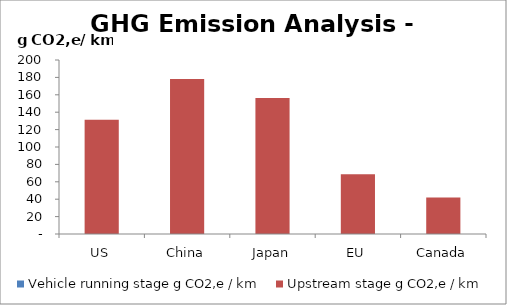
| Category | Vehicle running stage | Upstream stage |
|---|---|---|
| US | 0 | 131.458 |
| China | 0 | 178.304 |
| Japan | 0 | 156.315 |
| EU | 0 | 68.684 |
| Canada | 0 | 41.826 |